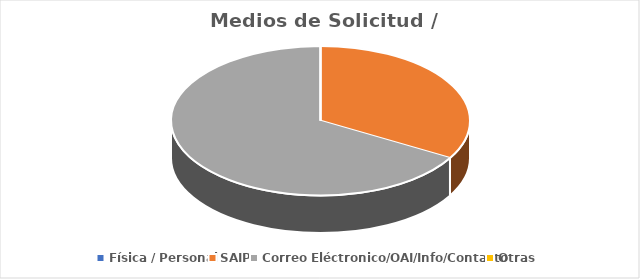
| Category | Series 0 |
|---|---|
| Física / Personal | 0 |
| SAIP | 1 |
| Correo Eléctronico/OAI/Info/Contacto | 2 |
| Otras | 0 |